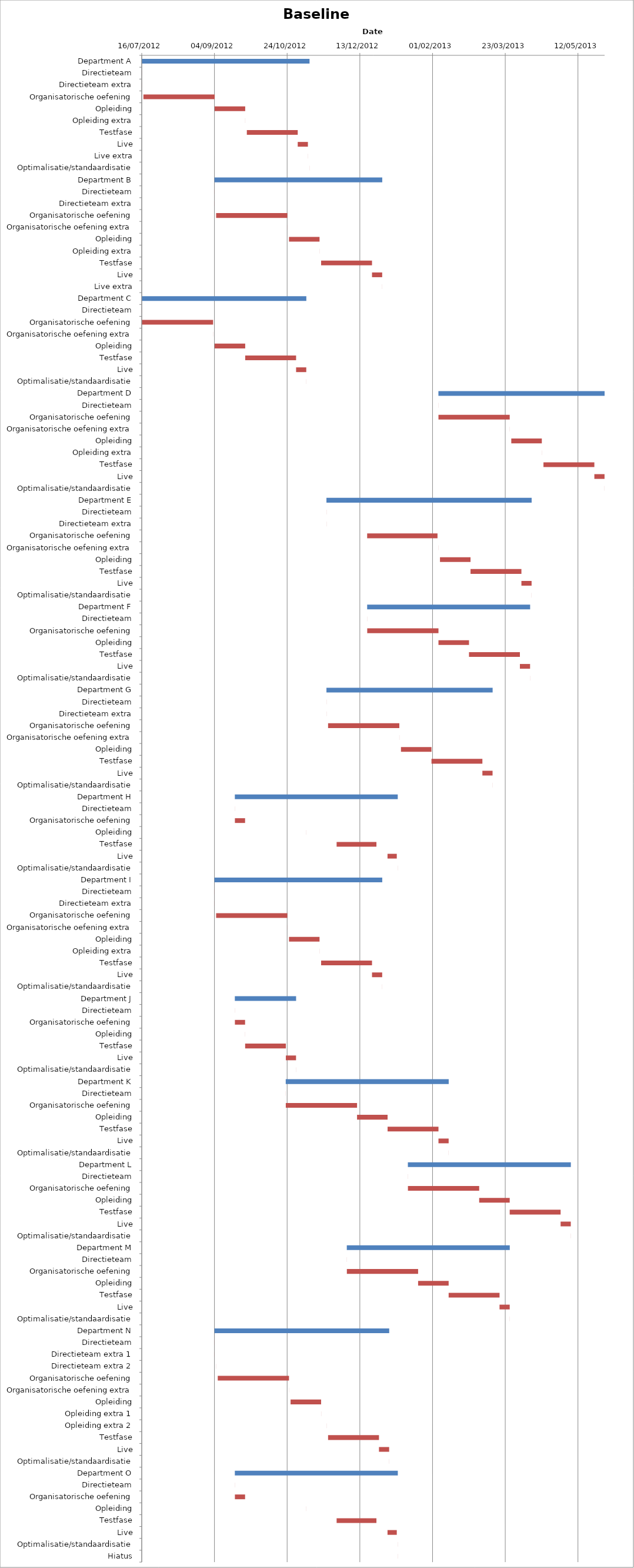
| Category | Baseline start | Actual duration |
|---|---|---|
| Department A | 41106.333 | 115.375 |
| Directieteam | 41106.333 | 0.042 |
| Directieteam extra | 41106.375 | 0.042 |
| Organisatorische oefening | 41107.458 | 49 |
| Opleiding | 41156.458 | 21 |
| Opleiding extra | 41177.458 | 0.042 |
| Testfase | 41178.583 | 35 |
| Live | 41213.583 | 7 |
| Live extra | 41220.583 | 0.042 |
| Optimalisatie/standaardisatie | 41221.667 | 0.042 |
| Department B | 41156.333 | 115.375 |
| Directieteam | 41156.333 | 0.042 |
| Directieteam extra | 41156.375 | 0.042 |
| Organisatorische oefening | 41157.458 | 49 |
| Organisatorische oefening extra | 41206.458 | 0.042 |
| Opleiding | 41207.583 | 21 |
| Opleiding extra | 41228.583 | 0.042 |
| Testfase | 41229.667 | 35 |
| Live | 41264.667 | 7 |
| Live extra | 41271.667 | 0.042 |
| Department C | 41106.333 | 113.167 |
| Directieteam | 41106.333 | 0.042 |
| Organisatorische oefening | 41106.375 | 49 |
| Organisatorische oefening extra | 41155.375 | 0.042 |
| Opleiding | 41156.458 | 21 |
| Testfase | 41177.458 | 35 |
| Live | 41212.458 | 7 |
| Optimalisatie/standaardisatie | 41219.458 | 0.042 |
| Department D | 41310.333 | 114.292 |
| Directieteam | 41310.333 | 0.042 |
| Organisatorische oefening | 41310.375 | 49 |
| Organisatorische oefening extra | 41359.375 | 0.042 |
| Opleiding | 41360.458 | 21 |
| Opleiding extra | 41381.458 | 0.042 |
| Testfase | 41382.583 | 35 |
| Live | 41417.583 | 7 |
| Optimalisatie/standaardisatie | 41424.583 | 0.042 |
| Department E | 41233.333 | 141.125 |
| Directieteam | 41233.333 | 0.042 |
| Directieteam extra | 41233.375 | 0.042 |
| Organisatorische oefening | 41261.333 | 48.375 |
| Organisatorische oefening extra | 41310.333 | 0.042 |
| Opleiding | 41311.417 | 21 |
| Testfase | 41332.417 | 35 |
| Live | 41367.417 | 7 |
| Optimalisatie/standaardisatie | 41374.417 | 0.042 |
| Department F | 41261.333 | 112.083 |
| Directieteam | 41261.333 | 0.042 |
| Organisatorische oefening | 41261.375 | 49 |
| Opleiding | 41310.375 | 21 |
| Testfase | 41331.375 | 35 |
| Live | 41366.375 | 7 |
| Optimalisatie/standaardisatie | 41373.375 | 0.042 |
| Department G | 41233.333 | 114.292 |
| Directieteam | 41233.333 | 0.042 |
| Directieteam extra | 41233.375 | 0.042 |
| Organisatorische oefening | 41234.458 | 49 |
| Organisatorische oefening extra | 41283.458 | 0.042 |
| Opleiding | 41284.583 | 21 |
| Testfase | 41305.583 | 35 |
| Live | 41340.583 | 7 |
| Optimalisatie/standaardisatie | 41347.583 | 0.042 |
| Department H | 41170.333 | 112.042 |
| Directieteam | 41170.333 | 0.042 |
| Organisatorische oefening | 41170.375 | 7 |
| Opleiding | 41219.333 | 0.042 |
| Testfase | 41240.333 | 27.375 |
| Live | 41275.333 | 6.375 |
| Optimalisatie/standaardisatie | 41282.333 | 0.042 |
| Department I | 41156.333 | 115.375 |
| Directieteam | 41156.333 | 0.042 |
| Directieteam extra | 41156.375 | 0.042 |
| Organisatorische oefening | 41157.458 | 49 |
| Organisatorische oefening extra | 41206.458 | 0.042 |
| Opleiding | 41207.583 | 21 |
| Opleiding extra | 41228.583 | 0.042 |
| Testfase | 41229.667 | 35 |
| Live | 41264.667 | 7 |
| Optimalisatie/standaardisatie | 41271.667 | 0.042 |
| Department J | 41170.333 | 42.125 |
| Directieteam | 41170.333 | 0.042 |
| Organisatorische oefening | 41170.375 | 7 |
| Opleiding | 41177.375 | 0.042 |
| Testfase | 41177.417 | 28 |
| Live | 41205.417 | 7 |
| Optimalisatie/standaardisatie | 41212.417 | 0.042 |
| Department K | 41205.333 | 112.083 |
| Directieteam | 41205.333 | 0.042 |
| Organisatorische oefening | 41205.375 | 49 |
| Opleiding | 41254.375 | 21 |
| Testfase | 41275.375 | 35 |
| Live | 41310.375 | 7 |
| Optimalisatie/standaardisatie | 41317.375 | 0.042 |
| Department L | 41289.333 | 112.083 |
| Directieteam | 41289.333 | 0.042 |
| Organisatorische oefening | 41289.375 | 49 |
| Opleiding | 41338.375 | 21 |
| Testfase | 41359.375 | 35 |
| Live | 41394.375 | 7 |
| Optimalisatie/standaardisatie | 41401.375 | 0.042 |
| Department M | 41247.333 | 112.083 |
| Directieteam | 41247.333 | 0.042 |
| Organisatorische oefening | 41247.375 | 49 |
| Opleiding | 41296.375 | 21 |
| Testfase | 41317.375 | 35 |
| Live | 41352.375 | 7 |
| Optimalisatie/standaardisatie | 41359.375 | 0.042 |
| Department N | 41156.333 | 120.167 |
| Directieteam | 41156.333 | 0.042 |
| Directieteam extra 1 | 41156.375 | 0.042 |
| Directieteam extra 2 | 41157.458 | 0.042 |
| Organisatorische oefening | 41158.583 | 49 |
| Organisatorische oefening extra | 41207.583 | 0.042 |
| Opleiding | 41208.667 | 21 |
| Opleiding extra 1 | 41229.667 | 0.042 |
| Opleiding extra 2 | 41233.375 | 0.042 |
| Testfase | 41234.458 | 35 |
| Live | 41269.458 | 7 |
| Optimalisatie/standaardisatie | 41276.458 | 0.042 |
| Department O | 41170.333 | 112.083 |
| Directieteam | 41170.333 | 0.042 |
| Organisatorische oefening | 41170.375 | 7 |
| Opleiding | 41219.333 | 0.042 |
| Testfase | 41240.333 | 27.375 |
| Live | 41275.333 | 6.375 |
| Optimalisatie/standaardisatie | 41282.333 | 0.042 |
| Hiatus | 41282.375 | 0.042 |